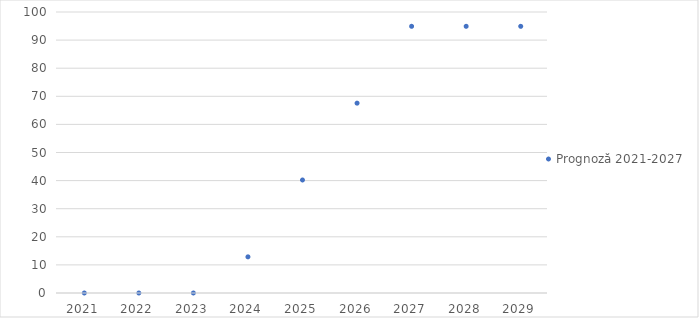
| Category | Prognoză 2021-2027 |
|---|---|
| 2021.0 | 0 |
| 2022.0 | 0 |
| 2023.0 | 0 |
| 2024.0 | 12.868 |
| 2025.0 | 40.214 |
| 2026.0 | 67.559 |
| 2027.0 | 94.904 |
| 2028.0 | 94.904 |
| 2029.0 | 94.904 |